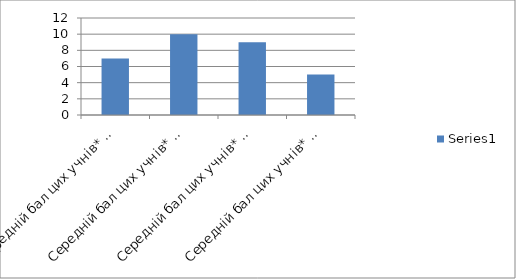
| Category | Series 0 |
|---|---|
| Середній бал цих учнів* за результатами ДПА у 9-му класі | 7 |
| Середній бал цих учнів* за результатами річного оцінювання у 10-му класі | 10 |
| Середній бал цих учнів* за результатами  річного оцінювання у 11-му класі | 9 |
| Середній бал цих учнів* за результатами ДПА у 11-му класі | 5 |